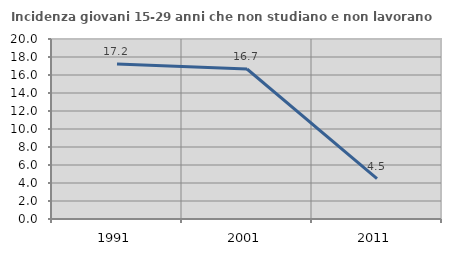
| Category | Incidenza giovani 15-29 anni che non studiano e non lavorano  |
|---|---|
| 1991.0 | 17.225 |
| 2001.0 | 16.667 |
| 2011.0 | 4.478 |